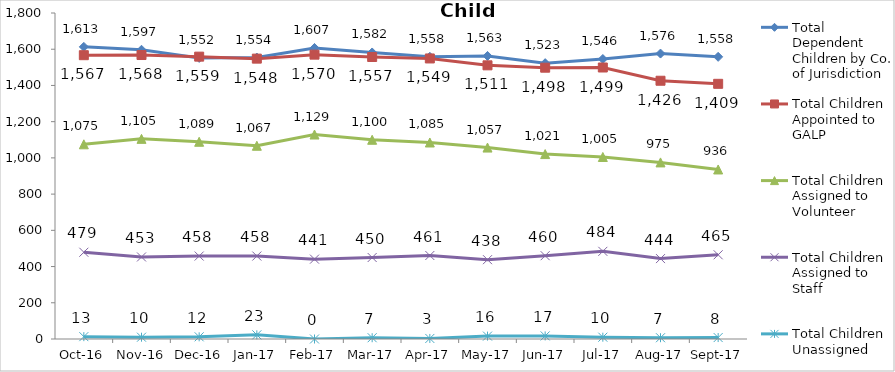
| Category | Total Dependent Children by Co. of Jurisdiction | Total Children Appointed to GALP | Total Children Assigned to Volunteer | Total Children Assigned to Staff | Total Children Unassigned |
|---|---|---|---|---|---|
| 2016-10-01 | 1613 | 1567 | 1075 | 479 | 13 |
| 2016-11-01 | 1597 | 1568 | 1105 | 453 | 10 |
| 2016-12-01 | 1552 | 1559 | 1089 | 458 | 12 |
| 2017-01-01 | 1554 | 1548 | 1067 | 458 | 23 |
| 2017-02-01 | 1607 | 1570 | 1129 | 441 | 0 |
| 2017-03-01 | 1582 | 1557 | 1100 | 450 | 7 |
| 2017-04-01 | 1558 | 1549 | 1085 | 461 | 3 |
| 2017-05-01 | 1563 | 1511 | 1057 | 438 | 16 |
| 2017-06-01 | 1523 | 1498 | 1021 | 460 | 17 |
| 2017-07-01 | 1546 | 1499 | 1005 | 484 | 10 |
| 2017-08-01 | 1576 | 1426 | 975 | 444 | 7 |
| 2017-09-01 | 1558 | 1409 | 936 | 465 | 8 |